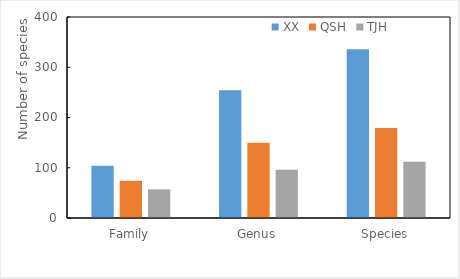
| Category | XX | QSH | TJH |
|---|---|---|---|
| Family | 104 | 74 | 57 |
| Genus | 254 | 150 | 96 |
| Species | 336 | 179 | 112 |